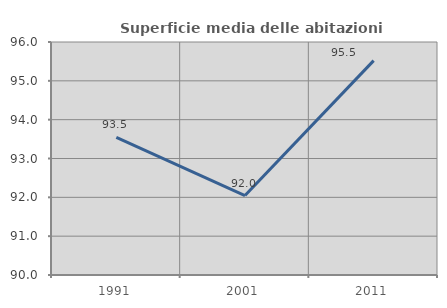
| Category | Superficie media delle abitazioni occupate |
|---|---|
| 1991.0 | 93.547 |
| 2001.0 | 92.046 |
| 2011.0 | 95.52 |